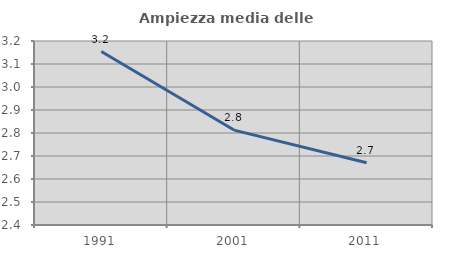
| Category | Ampiezza media delle famiglie |
|---|---|
| 1991.0 | 3.154 |
| 2001.0 | 2.813 |
| 2011.0 | 2.671 |